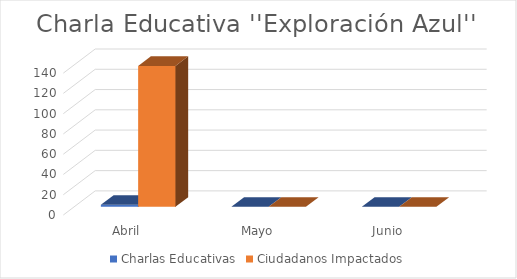
| Category | Charlas Educativas | Ciudadanos Impactados |
|---|---|---|
| Abril | 2 | 139 |
| Mayo | 0 | 0 |
| Junio | 0 | 0 |